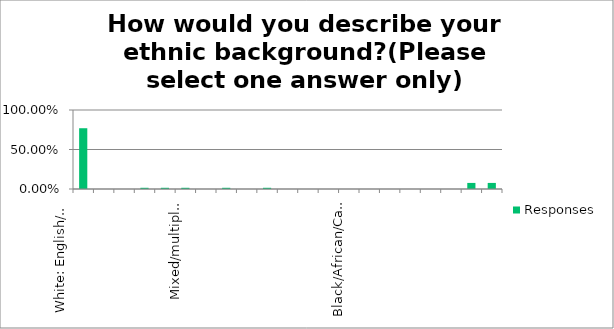
| Category | Responses |
|---|---|
| White: English/Welsh/Scottish/Northern Irish/British | 0.769 |
| White: Irish | 0 |
| White: Gypsy or Irish Traveller | 0 |
| White: Polish | 0.015 |
| White: Any other white background (write in box below if you wish) | 0.015 |
| Mixed/multiple ethnic groups: White and Black Caribbean | 0.015 |
| Mixed/multiple ethnic groups: White and Black African | 0 |
| Mixed/multiple ethnic groups: White and Asian | 0.015 |
| Mixed/multiple ethnic groups: Any other Mixed/multiple ethnic background (write in box below if you wish) | 0 |
| Asian/Asian British: Bangladeshi | 0.015 |
| Asian/Asian British: Indian | 0 |
| Asian/Asian British: Pakistani | 0 |
| Asian/Asian British: Chinese | 0 |
| Asian/Asian British: Any other Asian background (write in box below if you wish) | 0 |
| Black/African/Caribbean/Black British: African | 0 |
| Black/African/Caribbean/Black British: Caribbean | 0 |
| Black/African/Caribbean/Black British: Any other Black/African/Caribbean background  (write in box below if you wish) | 0 |
| Other: Arab | 0 |
| Other: Any other ethnic background  (write in box below if you wish) | 0 |
| Prefer not to say | 0.077 |
| Please specify in this box if you wish: | 0.077 |